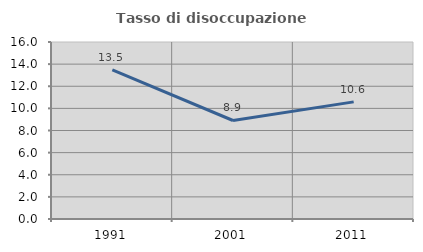
| Category | Tasso di disoccupazione giovanile  |
|---|---|
| 1991.0 | 13.478 |
| 2001.0 | 8.904 |
| 2011.0 | 10.588 |